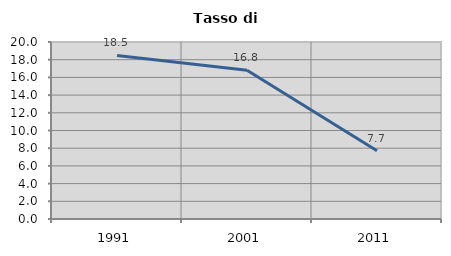
| Category | Tasso di disoccupazione   |
|---|---|
| 1991.0 | 18.487 |
| 2001.0 | 16.814 |
| 2011.0 | 7.704 |